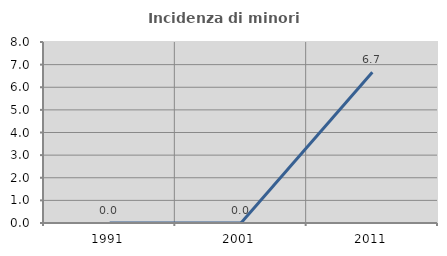
| Category | Incidenza di minori stranieri |
|---|---|
| 1991.0 | 0 |
| 2001.0 | 0 |
| 2011.0 | 6.667 |